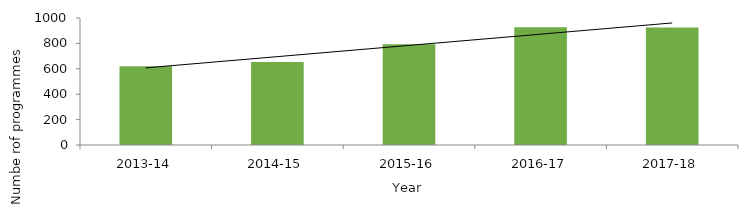
| Category | Series 0 |
|---|---|
| 2013-14 | 621 |
| 2014-15 | 653 |
| 2015-16 | 794 |
| 2016-17 | 927 |
| 2017-18 | 926 |